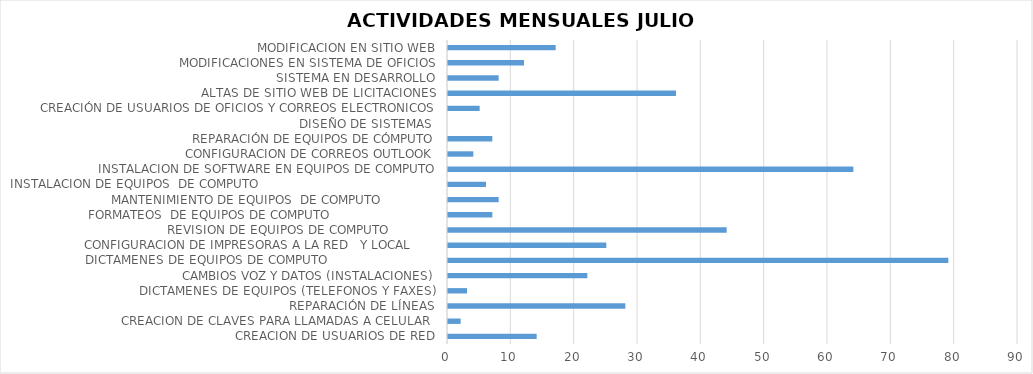
| Category | Series 0 |
|---|---|
| CREACION DE USUARIOS DE RED | 14 |
| CREACION DE CLAVES PARA LLAMADAS A CELULAR  | 2 |
| REPARACIÓN DE LÍNEAS | 28 |
| DICTAMENES DE EQUIPOS (TELEFONOS Y FAXES) | 3 |
| CAMBIOS VOZ Y DATOS (INSTALACIONES) | 22 |
| DICTAMENES DE EQUIPOS DE COMPUTO                             | 79 |
| CONFIGURACION DE IMPRESORAS A LA RED   Y LOCAL       | 25 |
| REVISION DE EQUIPOS DE COMPUTO             | 44 |
| FORMATEOS  DE EQUIPOS DE COMPUTO                            | 7 |
| MANTENIMIENTO DE EQUIPOS  DE COMPUTO               | 8 |
| INSTALACION DE EQUIPOS  DE COMPUTO                                               | 6 |
| INSTALACION DE SOFTWARE EN EQUIPOS DE COMPUTO | 64 |
| CONFIGURACION DE CORREOS OUTLOOK | 4 |
| REPARACIÓN DE EQUIPOS DE CÓMPUTO | 7 |
| DISEÑO DE SISTEMAS  | 0 |
| CREACIÓN DE USUARIOS DE OFICIOS Y CORREOS ELECTRONICOS | 5 |
| ALTAS DE SITIO WEB DE LICITACIONES | 36 |
| SISTEMA EN DESARROLLO | 8 |
| MODIFICACIONES EN SISTEMA DE OFICIOS | 12 |
| MODIFICACION EN SITIO WEB | 17 |